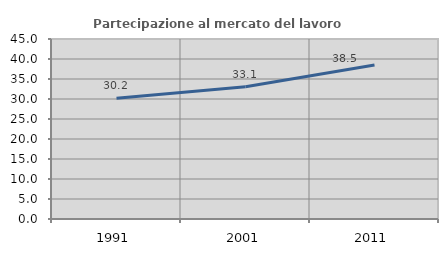
| Category | Partecipazione al mercato del lavoro  femminile |
|---|---|
| 1991.0 | 30.2 |
| 2001.0 | 33.075 |
| 2011.0 | 38.5 |